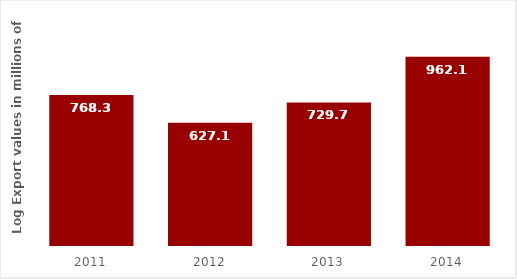
| Category | Series 0 |
|---|---|
| 2011.0 | 768.3 |
| 2012.0 | 627.1 |
| 2013.0 | 729.7 |
| 2014.0 | 962.1 |